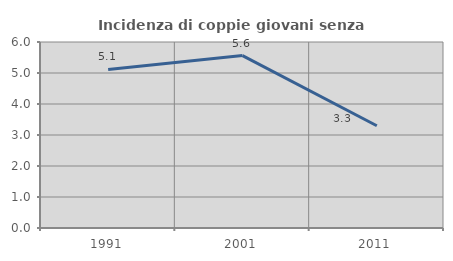
| Category | Incidenza di coppie giovani senza figli |
|---|---|
| 1991.0 | 5.115 |
| 2001.0 | 5.561 |
| 2011.0 | 3.299 |